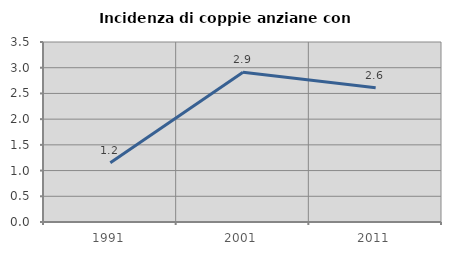
| Category | Incidenza di coppie anziane con figli |
|---|---|
| 1991.0 | 1.151 |
| 2001.0 | 2.913 |
| 2011.0 | 2.611 |